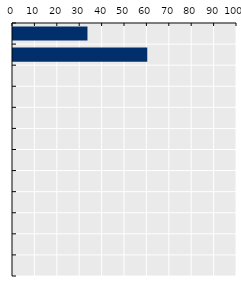
| Category | Payment rate (%) |
|---|---|
| Korea | 33.246 |
| Japan | 59.935 |
| OECD average | 0 |
| Viet Nam* | 0 |
| New Zealand | 0 |
| Australia | 0 |
| Singapore* | 0 |
| Mongolia* | 0 |
| Indonesia* | 0 |
| Thailand* | 0 |
| China | 0 |
| Malaysia* | 0 |